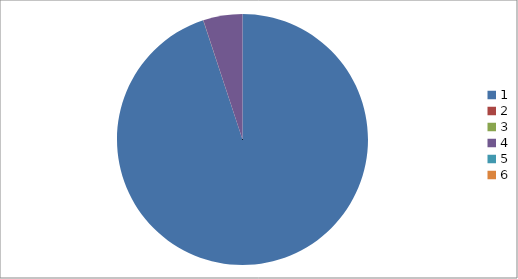
| Category | Series 0 |
|---|---|
| 0 | 0.949 |
| 1 | 0 |
| 2 | 0 |
| 3 | 0.051 |
| 4 | 0 |
| 5 | 0 |